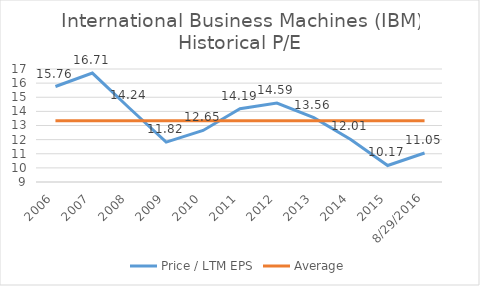
| Category | Price / LTM EPS | Average |
|---|---|---|
| 2006.0 | 15.76 | 13.341 |
| 2007.0 | 16.71 | 13.341 |
| 2008.0 | 14.24 | 13.341 |
| 2009.0 | 11.82 | 13.341 |
| 2010.0 | 12.65 | 13.341 |
| 2011.0 | 14.19 | 13.341 |
| 2012.0 | 14.59 | 13.341 |
| 2013.0 | 13.56 | 13.341 |
| 2014.0 | 12.01 | 13.341 |
| 2015.0 | 10.17 | 13.341 |
| 42611.0 | 11.05 | 13.341 |